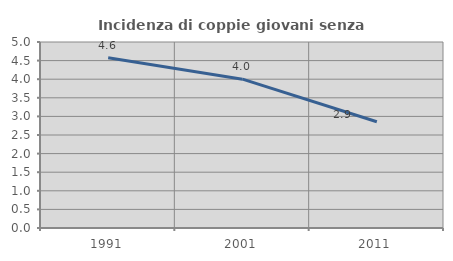
| Category | Incidenza di coppie giovani senza figli |
|---|---|
| 1991.0 | 4.576 |
| 2001.0 | 4.001 |
| 2011.0 | 2.855 |